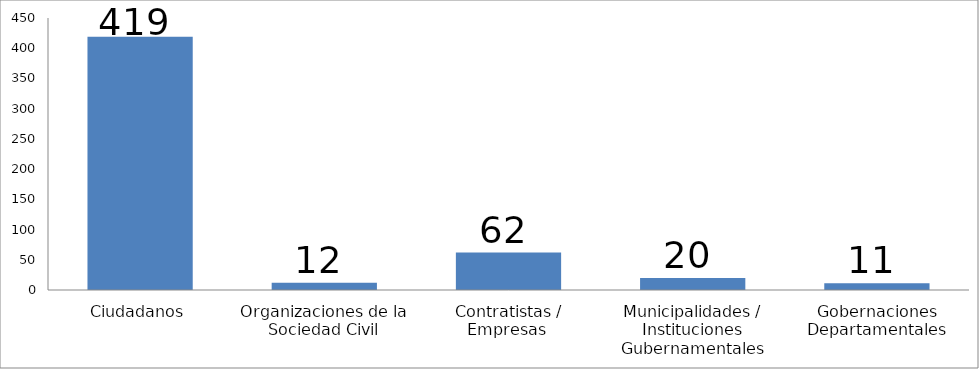
| Category | Series 0 |
|---|---|
| Ciudadanos | 419 |
| Organizaciones de la Sociedad Civil | 12 |
| Contratistas / Empresas  | 62 |
| Municipalidades / Instituciones Gubernamentales | 20 |
| Gobernaciones Departamentales | 11 |